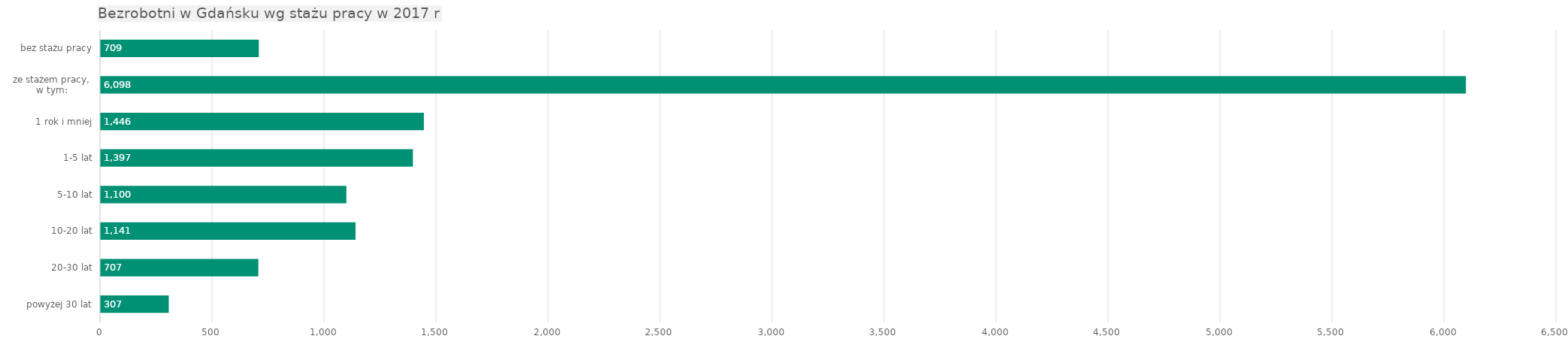
| Category | Series 0 |
|---|---|
| bez stażu pracy | 709 |
| ze stażem pracy,
w tym: | 6098 |
|      1 rok i mniej | 1446 |
|      1-5 lat | 1397 |
|      5-10 lat | 1100 |
|      10-20 lat | 1141 |
|      20-30 lat | 707 |
|      powyżej 30 lat | 307 |